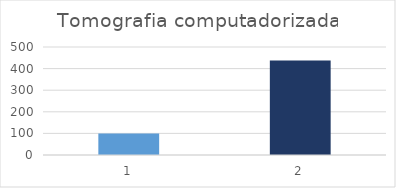
| Category | Tomografia computadorizada |
|---|---|
| 0 | 100 |
| 1 | 438 |